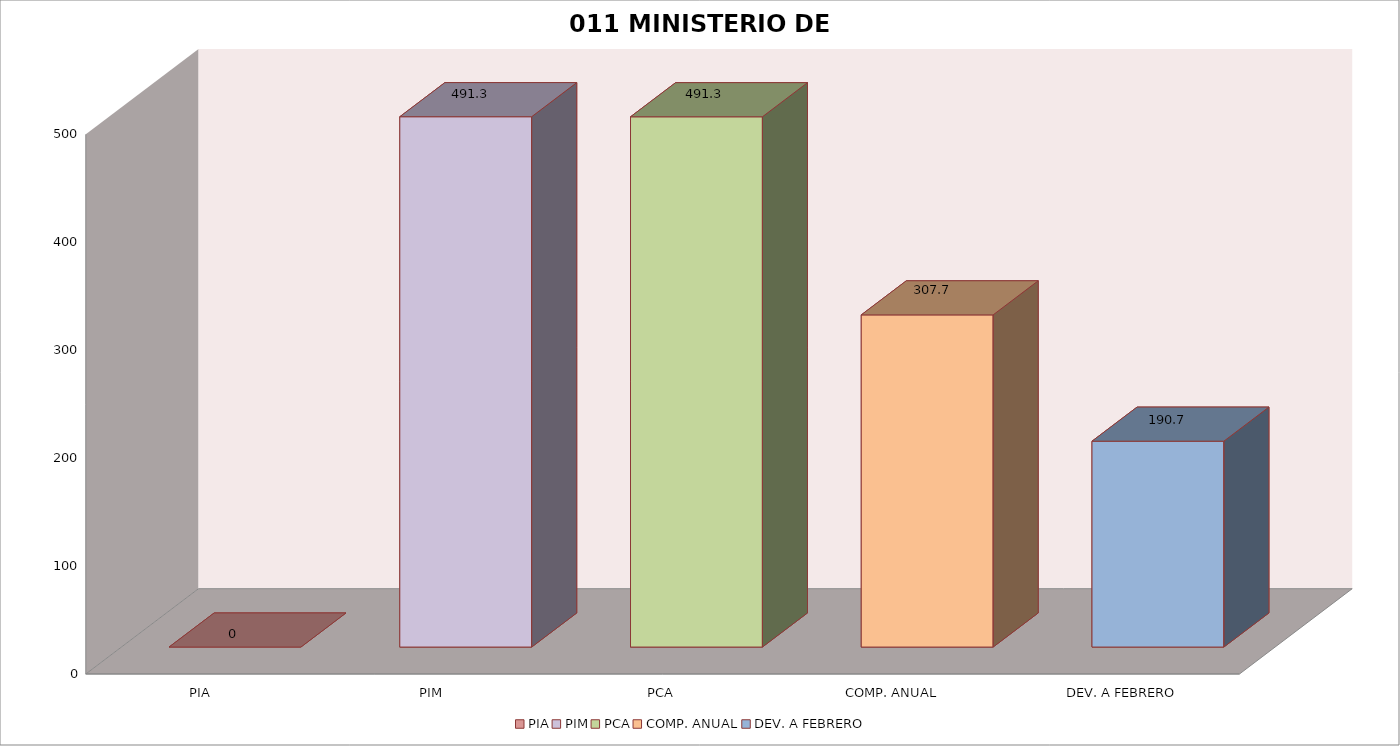
| Category | 011 MINISTERIO DE SALUD |
|---|---|
| PIA | 0 |
| PIM | 491.338 |
| PCA | 491.272 |
| COMP. ANUAL | 307.743 |
| DEV. A FEBRERO | 190.73 |